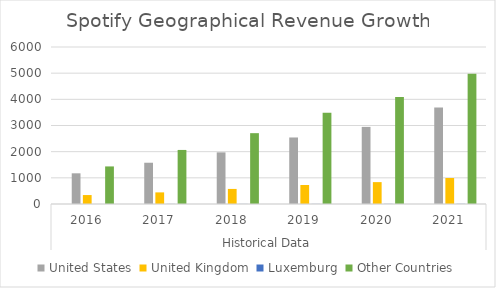
| Category | in millions of euros | United States | United Kingdom | Luxemburg | Other Countries |
|---|---|---|---|---|---|
| 0 |  | 1173 | 342 | 1 | 1436 |
| 1 |  | 1577 | 444 | 3 | 2066 |
| 2 |  | 1973 | 576 | 3 | 2707 |
| 3 |  | 2542 | 727 | 4 | 3491 |
| 4 |  | 2947 | 836 | 5 | 4092 |
| 5 |  | 3692 | 994 | 6 | 4976 |